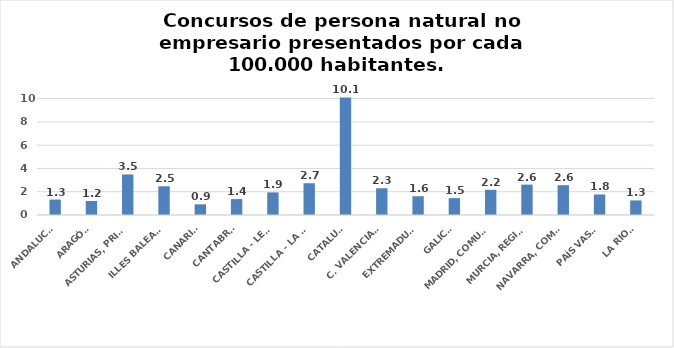
| Category | Series 0 |
|---|---|
| ANDALUCÍA | 1.328 |
| ARAGÓN | 1.207 |
| ASTURIAS, PRINCIPADO | 3.484 |
| ILLES BALEARS | 2.465 |
| CANARIAS | 0.919 |
| CANTABRIA | 1.367 |
| CASTILLA - LEÓN | 1.941 |
| CASTILLA - LA MANCHA | 2.729 |
| CATALUÑA | 10.099 |
| C. VALENCIANA | 2.298 |
| EXTREMADURA | 1.613 |
| GALICIA | 1.45 |
| MADRID, COMUNIDAD | 2.165 |
| MURCIA, REGIÓN | 2.612 |
| NAVARRA, COM. FORAL | 2.562 |
| PAÍS VASCO | 1.767 |
| LA RIOJA | 1.252 |